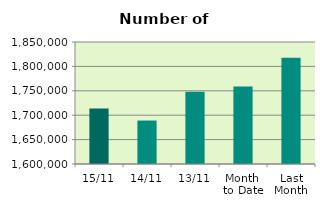
| Category | Series 0 |
|---|---|
| 15/11 | 1713698 |
| 14/11 | 1689048 |
| 13/11 | 1747994 |
| Month 
to Date | 1758918 |
| Last
Month | 1817802.609 |